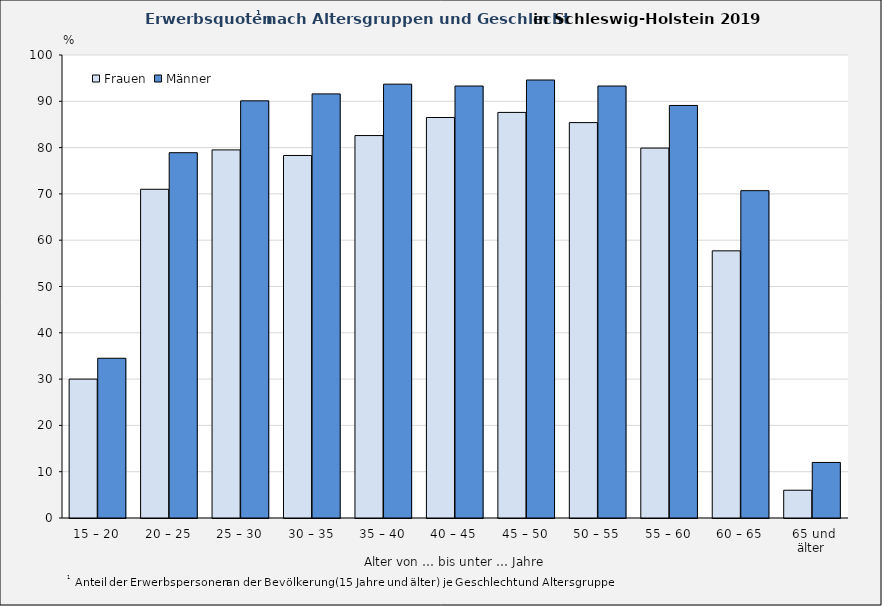
| Category | Frauen | Männer |
|---|---|---|
| 15 – 20 | 30 | 34.5 |
| 20 – 25 | 71 | 78.9 |
| 25 – 30 | 79.5 | 90.1 |
| 30 – 35 | 78.3 | 91.6 |
| 35 – 40 | 82.6 | 93.7 |
| 40 – 45 | 86.5 | 93.3 |
| 45 – 50 | 87.6 | 94.6 |
| 50 – 55 | 85.4 | 93.3 |
| 55 – 60 | 79.9 | 89.1 |
| 60 – 65 | 57.7 | 70.7 |
| 65 und älter  | 6 | 12 |